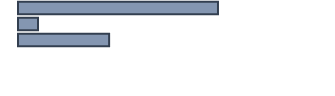
| Category | Series 0 |
|---|---|
| 0 | 64.3 |
| 1 | 6.4 |
| 2 | 29.3 |
| 3 | 0 |
| 4 | 0 |